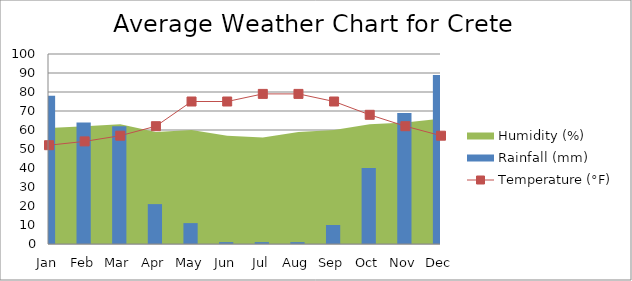
| Category | Rainfall (mm) |
|---|---|
| Jan | 78 |
| Feb | 64 |
| Mar | 62 |
| Apr | 21 |
| May | 11 |
| Jun | 1 |
| Jul | 1 |
| Aug | 1 |
| Sep | 10 |
| Oct | 40 |
| Nov | 69 |
| Dec | 89 |